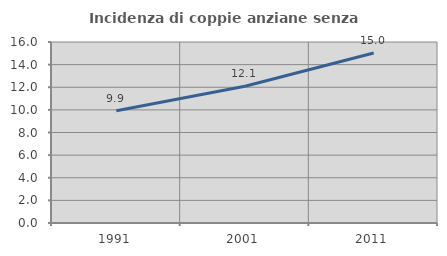
| Category | Incidenza di coppie anziane senza figli  |
|---|---|
| 1991.0 | 9.928 |
| 2001.0 | 12.092 |
| 2011.0 | 15.028 |